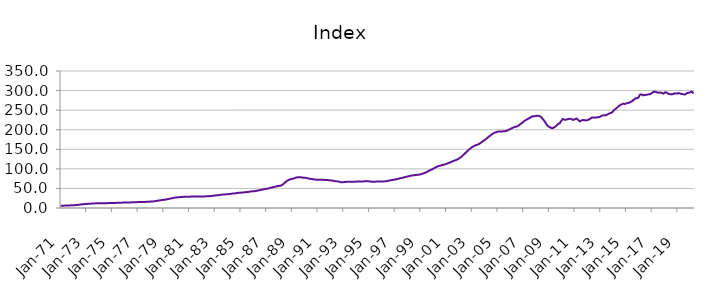
| Category | Index |
|---|---|
| 1971-01-01 | 5.879 |
| 1971-02-01 | 5.921 |
| 1971-03-01 | 5.963 |
| 1971-04-01 | 6.018 |
| 1971-05-01 | 6.108 |
| 1971-06-01 | 6.203 |
| 1971-07-01 | 6.32 |
| 1971-08-01 | 6.446 |
| 1971-09-01 | 6.572 |
| 1971-10-01 | 6.703 |
| 1971-11-01 | 6.844 |
| 1971-12-01 | 7.015 |
| 1972-01-01 | 7.135 |
| 1972-02-01 | 7.213 |
| 1972-03-01 | 7.39 |
| 1972-04-01 | 7.638 |
| 1972-05-01 | 7.997 |
| 1972-06-01 | 8.312 |
| 1972-07-01 | 8.674 |
| 1972-08-01 | 9.023 |
| 1972-09-01 | 9.332 |
| 1972-10-01 | 9.62 |
| 1972-11-01 | 9.887 |
| 1972-12-01 | 10.162 |
| 1973-01-01 | 10.359 |
| 1973-02-01 | 10.498 |
| 1973-03-01 | 10.658 |
| 1973-04-01 | 10.841 |
| 1973-05-01 | 11.075 |
| 1973-06-01 | 11.227 |
| 1973-07-01 | 11.386 |
| 1973-08-01 | 11.562 |
| 1973-09-01 | 11.768 |
| 1973-10-01 | 11.982 |
| 1973-11-01 | 12.145 |
| 1973-12-01 | 12.262 |
| 1974-01-01 | 12.324 |
| 1974-02-01 | 12.392 |
| 1974-03-01 | 12.389 |
| 1974-04-01 | 12.362 |
| 1974-05-01 | 12.339 |
| 1974-06-01 | 12.34 |
| 1974-07-01 | 12.352 |
| 1974-08-01 | 12.392 |
| 1974-09-01 | 12.465 |
| 1974-10-01 | 12.555 |
| 1974-11-01 | 12.63 |
| 1974-12-01 | 12.703 |
| 1975-01-01 | 12.737 |
| 1975-02-01 | 12.78 |
| 1975-03-01 | 12.857 |
| 1975-04-01 | 12.965 |
| 1975-05-01 | 13.097 |
| 1975-06-01 | 13.168 |
| 1975-07-01 | 13.237 |
| 1975-08-01 | 13.332 |
| 1975-09-01 | 13.462 |
| 1975-10-01 | 13.606 |
| 1975-11-01 | 13.732 |
| 1975-12-01 | 13.867 |
| 1976-01-01 | 13.963 |
| 1976-02-01 | 14.052 |
| 1976-03-01 | 14.114 |
| 1976-04-01 | 14.179 |
| 1976-05-01 | 14.264 |
| 1976-06-01 | 14.32 |
| 1976-07-01 | 14.382 |
| 1976-08-01 | 14.474 |
| 1976-09-01 | 14.605 |
| 1976-10-01 | 14.752 |
| 1976-11-01 | 14.87 |
| 1976-12-01 | 14.976 |
| 1977-01-01 | 15.034 |
| 1977-02-01 | 15.102 |
| 1977-03-01 | 15.145 |
| 1977-04-01 | 15.197 |
| 1977-05-01 | 15.276 |
| 1977-06-01 | 15.347 |
| 1977-07-01 | 15.436 |
| 1977-08-01 | 15.557 |
| 1977-09-01 | 15.705 |
| 1977-10-01 | 15.871 |
| 1977-11-01 | 16.048 |
| 1977-12-01 | 16.278 |
| 1978-01-01 | 16.449 |
| 1978-02-01 | 16.582 |
| 1978-03-01 | 16.762 |
| 1978-04-01 | 17.003 |
| 1978-05-01 | 17.391 |
| 1978-06-01 | 17.783 |
| 1978-07-01 | 18.258 |
| 1978-08-01 | 18.744 |
| 1978-09-01 | 19.213 |
| 1978-10-01 | 19.678 |
| 1978-11-01 | 20.113 |
| 1978-12-01 | 20.542 |
| 1979-01-01 | 20.797 |
| 1979-02-01 | 20.968 |
| 1979-03-01 | 21.394 |
| 1979-04-01 | 21.979 |
| 1979-05-01 | 22.725 |
| 1979-06-01 | 23.198 |
| 1979-07-01 | 23.69 |
| 1979-08-01 | 24.243 |
| 1979-09-01 | 24.906 |
| 1979-10-01 | 25.613 |
| 1979-11-01 | 26.202 |
| 1979-12-01 | 26.66 |
| 1980-01-01 | 26.911 |
| 1980-02-01 | 27.107 |
| 1980-03-01 | 27.357 |
| 1980-04-01 | 27.651 |
| 1980-05-01 | 27.994 |
| 1980-06-01 | 28.178 |
| 1980-07-01 | 28.344 |
| 1980-08-01 | 28.498 |
| 1980-09-01 | 28.607 |
| 1980-10-01 | 28.676 |
| 1980-11-01 | 28.73 |
| 1980-12-01 | 28.843 |
| 1981-01-01 | 28.911 |
| 1981-02-01 | 29.013 |
| 1981-03-01 | 29.116 |
| 1981-04-01 | 29.254 |
| 1981-05-01 | 29.394 |
| 1981-06-01 | 29.441 |
| 1981-07-01 | 29.464 |
| 1981-08-01 | 29.469 |
| 1981-09-01 | 29.414 |
| 1981-10-01 | 29.312 |
| 1981-11-01 | 29.219 |
| 1981-12-01 | 29.209 |
| 1982-01-01 | 29.164 |
| 1982-02-01 | 29.184 |
| 1982-03-01 | 29.346 |
| 1982-04-01 | 29.618 |
| 1982-05-01 | 29.924 |
| 1982-06-01 | 30.035 |
| 1982-07-01 | 30.119 |
| 1982-08-01 | 30.28 |
| 1982-09-01 | 30.54 |
| 1982-10-01 | 30.849 |
| 1982-11-01 | 31.157 |
| 1982-12-01 | 31.538 |
| 1983-01-01 | 31.828 |
| 1983-02-01 | 32.078 |
| 1983-03-01 | 32.337 |
| 1983-04-01 | 32.659 |
| 1983-05-01 | 33.081 |
| 1983-06-01 | 33.413 |
| 1983-07-01 | 33.773 |
| 1983-08-01 | 34.116 |
| 1983-09-01 | 34.39 |
| 1983-10-01 | 34.614 |
| 1983-11-01 | 34.826 |
| 1983-12-01 | 35.104 |
| 1984-01-01 | 35.27 |
| 1984-02-01 | 35.438 |
| 1984-03-01 | 35.758 |
| 1984-04-01 | 36.202 |
| 1984-05-01 | 36.71 |
| 1984-06-01 | 36.936 |
| 1984-07-01 | 37.124 |
| 1984-08-01 | 37.411 |
| 1984-09-01 | 37.87 |
| 1984-10-01 | 38.4 |
| 1984-11-01 | 38.81 |
| 1984-12-01 | 39.095 |
| 1985-01-01 | 39.174 |
| 1985-02-01 | 39.283 |
| 1985-03-01 | 39.552 |
| 1985-04-01 | 39.93 |
| 1985-05-01 | 40.361 |
| 1985-06-01 | 40.527 |
| 1985-07-01 | 40.681 |
| 1985-08-01 | 40.948 |
| 1985-09-01 | 41.393 |
| 1985-10-01 | 41.902 |
| 1985-11-01 | 42.329 |
| 1985-12-01 | 42.671 |
| 1986-01-01 | 42.803 |
| 1986-02-01 | 42.939 |
| 1986-03-01 | 43.335 |
| 1986-04-01 | 43.908 |
| 1986-05-01 | 44.624 |
| 1986-06-01 | 45.057 |
| 1986-07-01 | 45.499 |
| 1986-08-01 | 46.028 |
| 1986-09-01 | 46.692 |
| 1986-10-01 | 47.409 |
| 1986-11-01 | 48.06 |
| 1986-12-01 | 48.667 |
| 1987-01-01 | 49.02 |
| 1987-02-01 | 49.311 |
| 1987-03-01 | 49.944 |
| 1987-04-01 | 50.795 |
| 1987-05-01 | 51.813 |
| 1987-06-01 | 52.387 |
| 1987-07-01 | 52.937 |
| 1987-08-01 | 53.541 |
| 1987-09-01 | 54.197 |
| 1987-10-01 | 54.877 |
| 1987-11-01 | 55.513 |
| 1987-12-01 | 56.172 |
| 1988-01-01 | 56.486 |
| 1988-02-01 | 56.756 |
| 1988-03-01 | 57.701 |
| 1988-04-01 | 59.124 |
| 1988-05-01 | 61.264 |
| 1988-06-01 | 63.424 |
| 1988-07-01 | 65.968 |
| 1988-08-01 | 68.307 |
| 1988-09-01 | 70.109 |
| 1988-10-01 | 71.604 |
| 1988-11-01 | 72.807 |
| 1988-12-01 | 73.875 |
| 1989-01-01 | 74.434 |
| 1989-02-01 | 74.906 |
| 1989-03-01 | 75.707 |
| 1989-04-01 | 76.727 |
| 1989-05-01 | 77.807 |
| 1989-06-01 | 78.279 |
| 1989-07-01 | 78.601 |
| 1989-08-01 | 78.752 |
| 1989-09-01 | 78.622 |
| 1989-10-01 | 78.258 |
| 1989-11-01 | 77.774 |
| 1989-12-01 | 77.38 |
| 1990-01-01 | 77.025 |
| 1990-02-01 | 77.011 |
| 1990-03-01 | 76.482 |
| 1990-04-01 | 75.796 |
| 1990-05-01 | 74.994 |
| 1990-06-01 | 74.611 |
| 1990-07-01 | 74.285 |
| 1990-08-01 | 73.967 |
| 1990-09-01 | 73.52 |
| 1990-10-01 | 73.009 |
| 1990-11-01 | 72.535 |
| 1990-12-01 | 72.334 |
| 1991-01-01 | 72.192 |
| 1991-02-01 | 72.268 |
| 1991-03-01 | 72.153 |
| 1991-04-01 | 72.077 |
| 1991-05-01 | 71.977 |
| 1991-06-01 | 71.933 |
| 1991-07-01 | 71.885 |
| 1991-08-01 | 71.819 |
| 1991-09-01 | 71.705 |
| 1991-10-01 | 71.501 |
| 1991-11-01 | 71.166 |
| 1991-12-01 | 70.813 |
| 1992-01-01 | 70.463 |
| 1992-02-01 | 70.409 |
| 1992-03-01 | 69.918 |
| 1992-04-01 | 69.325 |
| 1992-05-01 | 68.671 |
| 1992-06-01 | 68.457 |
| 1992-07-01 | 68.303 |
| 1992-08-01 | 67.98 |
| 1992-09-01 | 67.29 |
| 1992-10-01 | 66.434 |
| 1992-11-01 | 65.854 |
| 1992-12-01 | 65.871 |
| 1993-01-01 | 66.034 |
| 1993-02-01 | 66.322 |
| 1993-03-01 | 66.581 |
| 1993-04-01 | 66.905 |
| 1993-05-01 | 67.182 |
| 1993-06-01 | 67.213 |
| 1993-07-01 | 67.233 |
| 1993-08-01 | 67.289 |
| 1993-09-01 | 67.247 |
| 1993-10-01 | 67.126 |
| 1993-11-01 | 67.046 |
| 1993-12-01 | 67.281 |
| 1994-01-01 | 67.604 |
| 1994-02-01 | 68.006 |
| 1994-03-01 | 67.991 |
| 1994-04-01 | 67.827 |
| 1994-05-01 | 67.683 |
| 1994-06-01 | 67.696 |
| 1994-07-01 | 67.777 |
| 1994-08-01 | 67.944 |
| 1994-09-01 | 68.21 |
| 1994-10-01 | 68.532 |
| 1994-11-01 | 68.685 |
| 1994-12-01 | 68.595 |
| 1995-01-01 | 68.092 |
| 1995-02-01 | 67.66 |
| 1995-03-01 | 67.497 |
| 1995-04-01 | 67.327 |
| 1995-05-01 | 67.356 |
| 1995-06-01 | 67.213 |
| 1995-07-01 | 67.36 |
| 1995-08-01 | 67.425 |
| 1995-09-01 | 67.463 |
| 1995-10-01 | 67.439 |
| 1995-11-01 | 67.524 |
| 1995-12-01 | 67.607 |
| 1996-01-01 | 67.632 |
| 1996-02-01 | 67.59 |
| 1996-03-01 | 67.814 |
| 1996-04-01 | 68.077 |
| 1996-05-01 | 68.578 |
| 1996-06-01 | 68.945 |
| 1996-07-01 | 69.543 |
| 1996-08-01 | 70.122 |
| 1996-09-01 | 70.708 |
| 1996-10-01 | 71.134 |
| 1996-11-01 | 71.585 |
| 1996-12-01 | 72.224 |
| 1997-01-01 | 72.682 |
| 1997-02-01 | 73.17 |
| 1997-03-01 | 73.587 |
| 1997-04-01 | 74.264 |
| 1997-05-01 | 75.148 |
| 1997-06-01 | 75.819 |
| 1997-07-01 | 76.292 |
| 1997-08-01 | 77.048 |
| 1997-09-01 | 77.723 |
| 1997-10-01 | 78.598 |
| 1997-11-01 | 79.21 |
| 1997-12-01 | 79.988 |
| 1998-01-01 | 80.449 |
| 1998-02-01 | 81.141 |
| 1998-03-01 | 81.745 |
| 1998-04-01 | 82.495 |
| 1998-05-01 | 83.027 |
| 1998-06-01 | 83.355 |
| 1998-07-01 | 83.747 |
| 1998-08-01 | 84.113 |
| 1998-09-01 | 84.484 |
| 1998-10-01 | 84.731 |
| 1998-11-01 | 85.018 |
| 1998-12-01 | 85.363 |
| 1999-01-01 | 85.875 |
| 1999-02-01 | 86.896 |
| 1999-03-01 | 87.796 |
| 1999-04-01 | 88.688 |
| 1999-05-01 | 89.666 |
| 1999-06-01 | 90.701 |
| 1999-07-01 | 91.918 |
| 1999-08-01 | 93.495 |
| 1999-09-01 | 95.101 |
| 1999-10-01 | 96.577 |
| 1999-11-01 | 97.58 |
| 1999-12-01 | 98.926 |
| 2000-01-01 | 100 |
| 2000-02-01 | 101.936 |
| 2000-03-01 | 103.455 |
| 2000-04-01 | 105.075 |
| 2000-05-01 | 105.895 |
| 2000-06-01 | 106.901 |
| 2000-07-01 | 107.798 |
| 2000-08-01 | 108.633 |
| 2000-09-01 | 109.409 |
| 2000-10-01 | 110.207 |
| 2000-11-01 | 110.863 |
| 2000-12-01 | 111.699 |
| 2001-01-01 | 112.376 |
| 2001-02-01 | 113.427 |
| 2001-03-01 | 114.41 |
| 2001-04-01 | 115.617 |
| 2001-05-01 | 116.92 |
| 2001-06-01 | 118 |
| 2001-07-01 | 119.178 |
| 2001-08-01 | 120.352 |
| 2001-09-01 | 121.415 |
| 2001-10-01 | 122.129 |
| 2001-11-01 | 123.346 |
| 2001-12-01 | 124.695 |
| 2002-01-01 | 126.498 |
| 2002-02-01 | 128.249 |
| 2002-03-01 | 130.341 |
| 2002-04-01 | 132.594 |
| 2002-05-01 | 135.137 |
| 2002-06-01 | 137.714 |
| 2002-07-01 | 140.534 |
| 2002-08-01 | 143.04 |
| 2002-09-01 | 145.7 |
| 2002-10-01 | 148.191 |
| 2002-11-01 | 150.379 |
| 2002-12-01 | 152.788 |
| 2003-01-01 | 154.938 |
| 2003-02-01 | 156.702 |
| 2003-03-01 | 158.127 |
| 2003-04-01 | 159.492 |
| 2003-05-01 | 160.649 |
| 2003-06-01 | 161.58 |
| 2003-07-01 | 162.401 |
| 2003-08-01 | 164.014 |
| 2003-09-01 | 165.699 |
| 2003-10-01 | 167.901 |
| 2003-11-01 | 170.039 |
| 2003-12-01 | 171.829 |
| 2004-01-01 | 173.609 |
| 2004-02-01 | 175.589 |
| 2004-03-01 | 177.991 |
| 2004-04-01 | 180.138 |
| 2004-05-01 | 182.465 |
| 2004-06-01 | 184.54 |
| 2004-07-01 | 186.551 |
| 2004-08-01 | 188.625 |
| 2004-09-01 | 190.257 |
| 2004-10-01 | 192.019 |
| 2004-11-01 | 192.962 |
| 2004-12-01 | 193.904 |
| 2005-01-01 | 194.627 |
| 2005-02-01 | 195.72 |
| 2005-03-01 | 195.655 |
| 2005-04-01 | 195.754 |
| 2005-05-01 | 195.194 |
| 2005-06-01 | 195.793 |
| 2005-07-01 | 195.867 |
| 2005-08-01 | 196.175 |
| 2005-09-01 | 196.736 |
| 2005-10-01 | 197.938 |
| 2005-11-01 | 198.884 |
| 2005-12-01 | 200.645 |
| 2006-01-01 | 201.661 |
| 2006-02-01 | 203.374 |
| 2006-03-01 | 204.511 |
| 2006-04-01 | 205.861 |
| 2006-05-01 | 206.826 |
| 2006-06-01 | 207.511 |
| 2006-07-01 | 208.388 |
| 2006-08-01 | 209.567 |
| 2006-09-01 | 211.353 |
| 2006-10-01 | 213.443 |
| 2006-11-01 | 215.14 |
| 2006-12-01 | 217.475 |
| 2007-01-01 | 219.496 |
| 2007-02-01 | 222.231 |
| 2007-03-01 | 223.7 |
| 2007-04-01 | 225.58 |
| 2007-05-01 | 226.869 |
| 2007-06-01 | 228.812 |
| 2007-07-01 | 229.701 |
| 2007-08-01 | 231.63 |
| 2007-09-01 | 233.384 |
| 2007-10-01 | 234.664 |
| 2007-11-01 | 234.312 |
| 2007-12-01 | 234.555 |
| 2008-01-01 | 235.086 |
| 2008-02-01 | 236.026 |
| 2008-03-01 | 235.364 |
| 2008-04-01 | 234.965 |
| 2008-05-01 | 233.6 |
| 2008-06-01 | 231.702 |
| 2008-07-01 | 228.29 |
| 2008-08-01 | 225.152 |
| 2008-09-01 | 221.485 |
| 2008-10-01 | 217.485 |
| 2008-11-01 | 212.758 |
| 2008-12-01 | 209.323 |
| 2009-01-01 | 207.652 |
| 2009-02-01 | 206.212 |
| 2009-03-01 | 204.576 |
| 2009-04-01 | 203.86 |
| 2009-05-01 | 204.572 |
| 2009-06-01 | 206.247 |
| 2009-07-01 | 207.906 |
| 2009-08-01 | 210.209 |
| 2009-09-01 | 213.072 |
| 2009-10-01 | 215.548 |
| 2009-11-01 | 216.169 |
| 2009-12-01 | 220.435 |
| 2010-01-01 | 223.882 |
| 2010-02-01 | 227.544 |
| 2010-03-01 | 226.207 |
| 2010-04-01 | 225.371 |
| 2010-05-01 | 225.616 |
| 2010-06-01 | 226.496 |
| 2010-07-01 | 227.242 |
| 2010-08-01 | 228.031 |
| 2010-09-01 | 227.934 |
| 2010-10-01 | 227.086 |
| 2010-11-01 | 225.565 |
| 2010-12-01 | 225.596 |
| 2011-01-01 | 226.214 |
| 2011-02-01 | 228.039 |
| 2011-03-01 | 228.503 |
| 2011-04-01 | 226.162 |
| 2011-05-01 | 223.102 |
| 2011-06-01 | 221.419 |
| 2011-07-01 | 222.781 |
| 2011-08-01 | 224.513 |
| 2011-09-01 | 224.472 |
| 2011-10-01 | 224.841 |
| 2011-11-01 | 223.579 |
| 2011-12-01 | 223.822 |
| 2012-01-01 | 224.584 |
| 2012-02-01 | 225.473 |
| 2012-03-01 | 227.466 |
| 2012-04-01 | 228.575 |
| 2012-05-01 | 231.11 |
| 2012-06-01 | 231.251 |
| 2012-07-01 | 231.282 |
| 2012-08-01 | 230.612 |
| 2012-09-01 | 231.126 |
| 2012-10-01 | 231.503 |
| 2012-11-01 | 231.747 |
| 2012-12-01 | 232.346 |
| 2013-01-01 | 233.26 |
| 2013-02-01 | 235.199 |
| 2013-03-01 | 236.287 |
| 2013-04-01 | 236.897 |
| 2013-05-01 | 236.822 |
| 2013-06-01 | 237.016 |
| 2013-07-01 | 237.888 |
| 2013-08-01 | 239.493 |
| 2013-09-01 | 240.786 |
| 2013-10-01 | 242.115 |
| 2013-11-01 | 242.898 |
| 2013-12-01 | 244.057 |
| 2014-01-01 | 247.816 |
| 2014-02-01 | 250.169 |
| 2014-03-01 | 252.769 |
| 2014-04-01 | 254.326 |
| 2014-05-01 | 257.246 |
| 2014-06-01 | 260.069 |
| 2014-07-01 | 261.53 |
| 2014-08-01 | 263.472 |
| 2014-09-01 | 264.905 |
| 2014-10-01 | 266.07 |
| 2014-11-01 | 266.347 |
| 2014-12-01 | 265.659 |
| 2015-01-01 | 266.928 |
| 2015-02-01 | 267.88 |
| 2015-03-01 | 268.307 |
| 2015-04-01 | 269.155 |
| 2015-05-01 | 270.34 |
| 2015-06-01 | 272.163 |
| 2015-07-01 | 273.277 |
| 2015-08-01 | 276.288 |
| 2015-09-01 | 278.116 |
| 2015-10-01 | 280.486 |
| 2015-11-01 | 280.294 |
| 2015-12-01 | 281.199 |
| 2016-01-01 | 283.607 |
| 2016-02-01 | 289.619 |
| 2016-03-01 | 290.057 |
| 2016-04-01 | 289.886 |
| 2016-05-01 | 287.681 |
| 2016-06-01 | 288.483 |
| 2016-07-01 | 288.661 |
| 2016-08-01 | 289.259 |
| 2016-09-01 | 289.711 |
| 2016-10-01 | 290.701 |
| 2016-11-01 | 290.463 |
| 2016-12-01 | 291.375 |
| 2017-01-01 | 293.717 |
| 2017-02-01 | 295.456 |
| 2017-03-01 | 297.078 |
| 2017-04-01 | 296.912 |
| 2017-05-01 | 296.553 |
| 2017-06-01 | 295.078 |
| 2017-07-01 | 294.677 |
| 2017-08-01 | 294.669 |
| 2017-09-01 | 295.305 |
| 2017-10-01 | 294.345 |
| 2017-11-01 | 293.162 |
| 2017-12-01 | 292.069 |
| 2018-01-01 | 294.449 |
| 2018-02-01 | 295.846 |
| 2018-03-01 | 294.92 |
| 2018-04-01 | 292.924 |
| 2018-05-01 | 291.472 |
| 2018-06-01 | 291.002 |
| 2018-07-01 | 290.236 |
| 2018-08-01 | 290.758 |
| 2018-09-01 | 291.058 |
| 2018-10-01 | 292.824 |
| 2018-11-01 | 292.65 |
| 2018-12-01 | 292.367 |
| 2019-01-01 | 292.519 |
| 2019-02-01 | 293.9 |
| 2019-03-01 | 292.871 |
| 2019-04-01 | 291.841 |
| 2019-05-01 | 291.513 |
| 2019-06-01 | 290.998 |
| 2019-07-01 | 290.148 |
| 2019-08-01 | 289.99 |
| 2019-09-01 | 291.573 |
| 2019-10-01 | 293.571 |
| 2019-11-01 | 294.348 |
| 2019-12-01 | 294.551 |
| 2020-01-01 | 295.312 |
| 2020-02-01 | 297.017 |
| 2020-03-01 | 296.23 |
| 2020-04-01 | 292.699 |